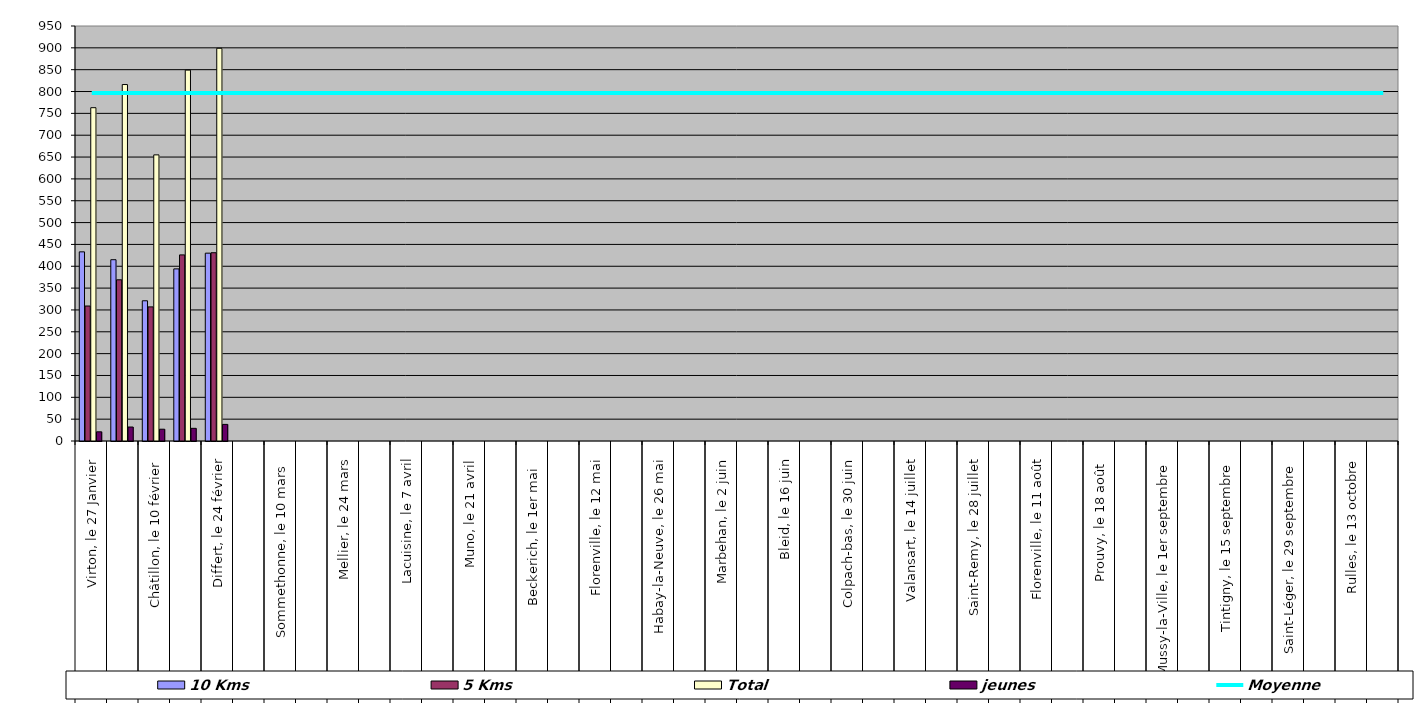
| Category | 10 Kms | 5 Kms | Total | jeunes |
|---|---|---|---|---|
| 0 | 433 | 309 | 763 | 21 |
| 1 | 415 | 369 | 816 | 32 |
| 2 | 321 | 307 | 655 | 27 |
| 3 | 394 | 426 | 849 | 29 |
| 4 | 430 | 431 | 899 | 38 |
| 5 | 0 | 0 | 0 | 0 |
| 6 | 0 | 0 | 0 | 0 |
| 7 | 0 | 0 | 0 | 0 |
| 8 | 0 | 0 | 0 | 0 |
| 9 | 0 | 0 | 0 | 0 |
| 10 | 0 | 0 | 0 | 0 |
| 11 | 0 | 0 | 0 | 0 |
| 12 | 0 | 0 | 0 | 0 |
| 13 | 0 | 0 | 0 | 0 |
| 14 | 0 | 0 | 0 | 0 |
| 15 | 0 | 0 | 0 | 0 |
| 16 | 0 | 0 | 0 | 0 |
| 17 | 0 | 0 | 0 | 0 |
| 18 | 0 | 0 | 0 | 0 |
| 19 | 0 | 0 | 0 | 0 |
| 20 | 0 | 0 | 0 | 0 |
| 21 | 0 | 0 | 0 | 0 |
| 22 | 0 | 0 | 0 | 0 |
| 23 | 0 | 0 | 0 | 0 |
| 24 | 0 | 0 | 0 | 0 |
| 25 | 0 | 0 | 0 | 0 |
| 26 | 0 | 0 | 0 | 0 |
| 27 | 0 | 0 | 0 | 0 |
| 28 | 0 | 0 | 0 | 0 |
| 29 | 0 | 0 | 0 | 0 |
| 30 | 0 | 0 | 0 | 0 |
| 31 | 0 | 0 | 0 | 0 |
| 32 | 0 | 0 | 0 | 0 |
| 33 | 0 | 0 | 0 | 0 |
| 34 | 0 | 0 | 0 | 0 |
| 35 | 0 | 0 | 0 | 0 |
| 36 | 0 | 0 | 0 | 0 |
| 37 | 0 | 0 | 0 | 0 |
| 38 | 0 | 0 | 0 | 0 |
| 39 | 0 | 0 | 0 | 0 |
| 40 | 0 | 0 | 0 | 0 |
| 41 | 0 | 0 | 0 | 0 |